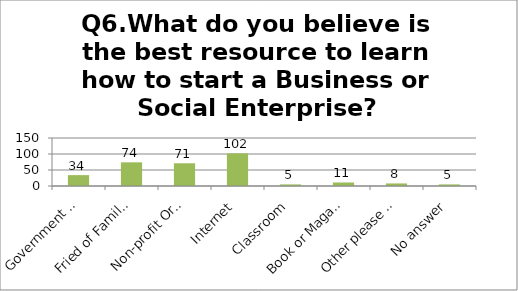
| Category | Q6.What do you believe is the best resource to learn how to start a Business or Social Enterprise? |
|---|---|
| Government Sources | 34 |
| Fried of Family Member | 74 |
| Non-profit Organization | 71 |
| Internet | 102 |
| Classroom | 5 |
| Book or Magazine | 11 |
| Other please specify | 8 |
| No answer | 5 |